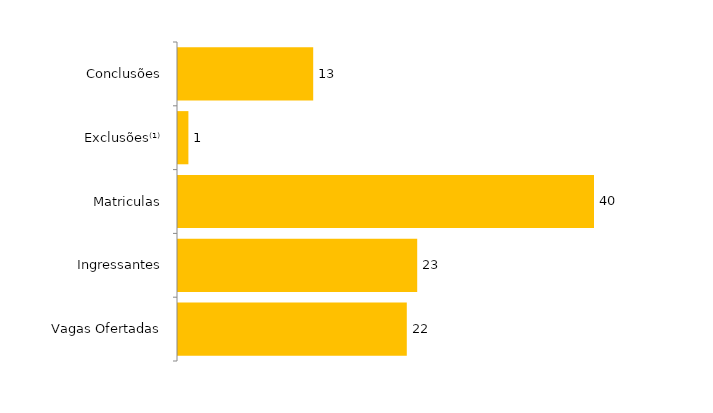
| Category | Total (2012) |
|---|---|
| Vagas Ofertadas | 22 |
| Ingressantes | 23 |
| Matriculas | 40 |
| Exclusões⁽¹⁾ | 1 |
| Conclusões | 13 |